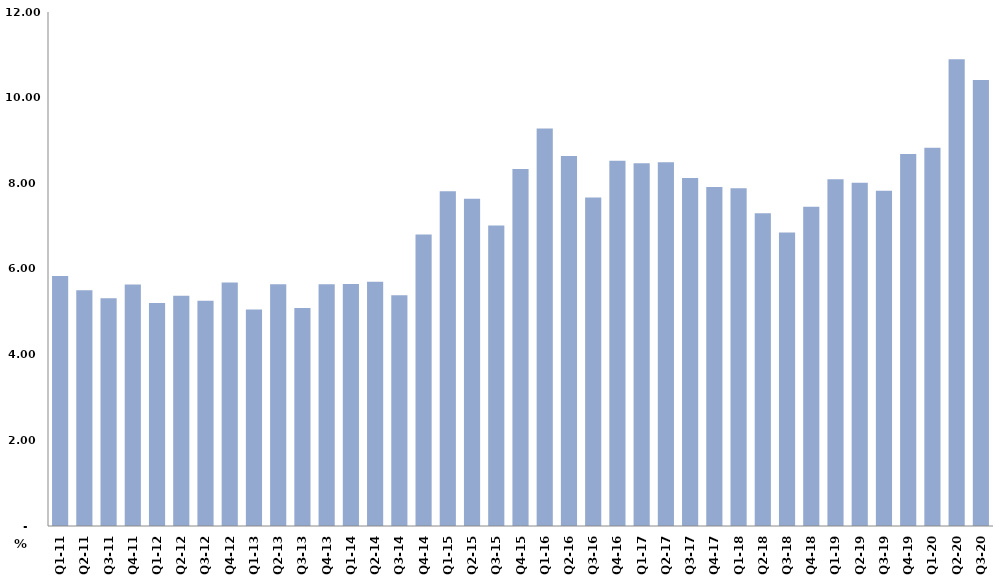
| Category | النسبة المئوية من الناتج المحلي الاجمالي
Percent of Total GDP |
|---|---|
| Q1-11 | 5.834 |
| Q2-11 | 5.503 |
| Q3-11 | 5.32 |
| Q4-11 | 5.641 |
| Q1-12 | 5.205 |
| Q2-12 | 5.378 |
| Q3-12 | 5.257 |
| Q4-12 | 5.688 |
| Q1-13 | 5.057 |
| Q2-13 | 5.643 |
| Q3-13 | 5.089 |
| Q4-13 | 5.642 |
| Q1-14 | 5.652 |
| Q2-14 | 5.703 |
| Q3-14 | 5.388 |
| Q4-14 | 6.804 |
| Q1-15 | 7.816 |
| Q2-15 | 7.64 |
| Q3-15 | 7.014 |
| Q4-15 | 8.337 |
| Q1-16 | 9.282 |
| Q2-16 | 8.638 |
| Q3-16 | 7.669 |
| Q4-16 | 8.525 |
| Q1-17 | 8.468 |
| Q2-17 | 8.493 |
| Q3-17 | 8.124 |
| Q4-17 | 7.916 |
| Q1-18 | 7.885 |
| Q2-18 | 7.3 |
| Q3-18 | 6.85 |
| Q4-18 | 7.453 |
| Q1-19 | 8.094 |
| Q2-19 | 8.013 |
| Q3-19 | 7.828 |
| Q4-19 | 8.688 |
| Q1-20 | 8.833 |
| Q2-20 | 10.898 |
| Q3-20 | 10.413 |